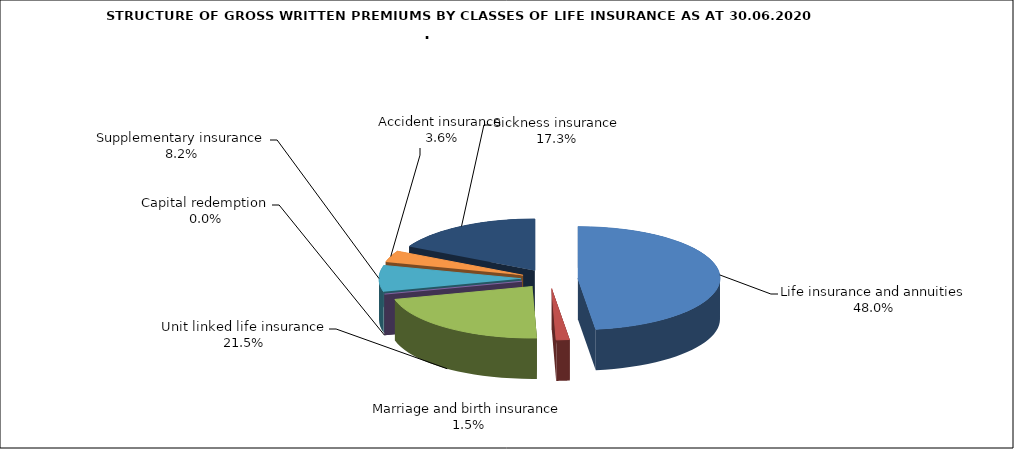
| Category | Life insurance and annuities |
|---|---|
| Life insurance and annuities | 109193821.483 |
| Marriage and birth insurance | 3445768.108 |
| Unit linked life insurance | 48817080.237 |
| Capital redemption | 0 |
| Supplementary insurance | 18636597.025 |
| Accident insurance | 8152764.12 |
| Sickness insurance | 39279906.96 |